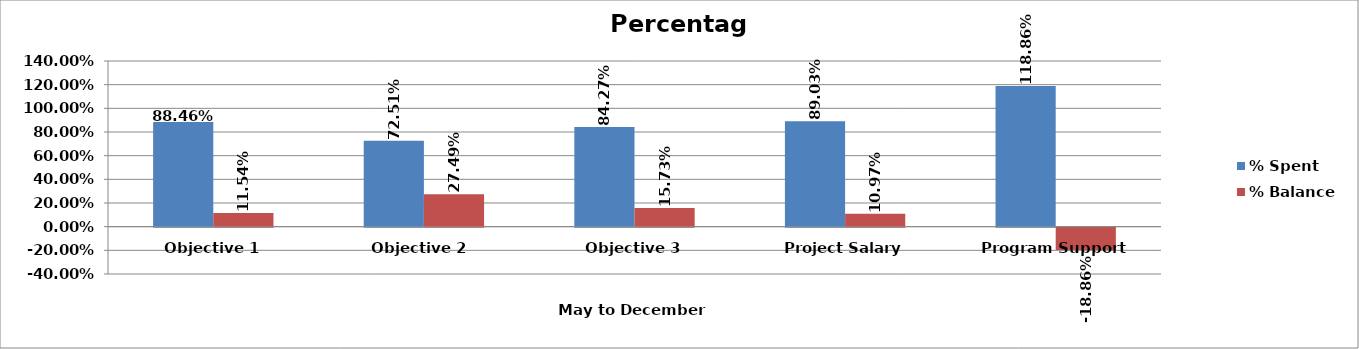
| Category |  % Spent   |  % Balance   |
|---|---|---|
| Objective 1 | 0.885 | 0.115 |
| Objective 2  | 0.725 | 0.275 |
| Objective 3 | 0.843 | 0.157 |
| Project Salary | 0.89 | 0.11 |
| Program Support | 1.189 | -0.189 |